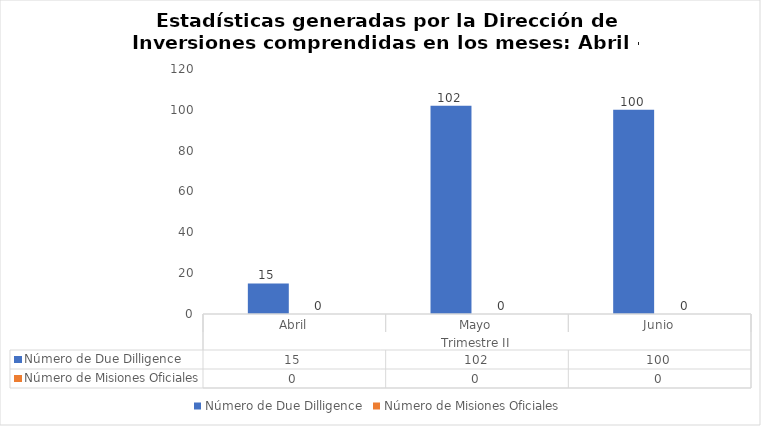
| Category | Número de Due Dilligence | Número de Misiones Oficiales |
|---|---|---|
| 0 | 15 | 0 |
| 1 | 102 | 0 |
| 2 | 100 | 0 |